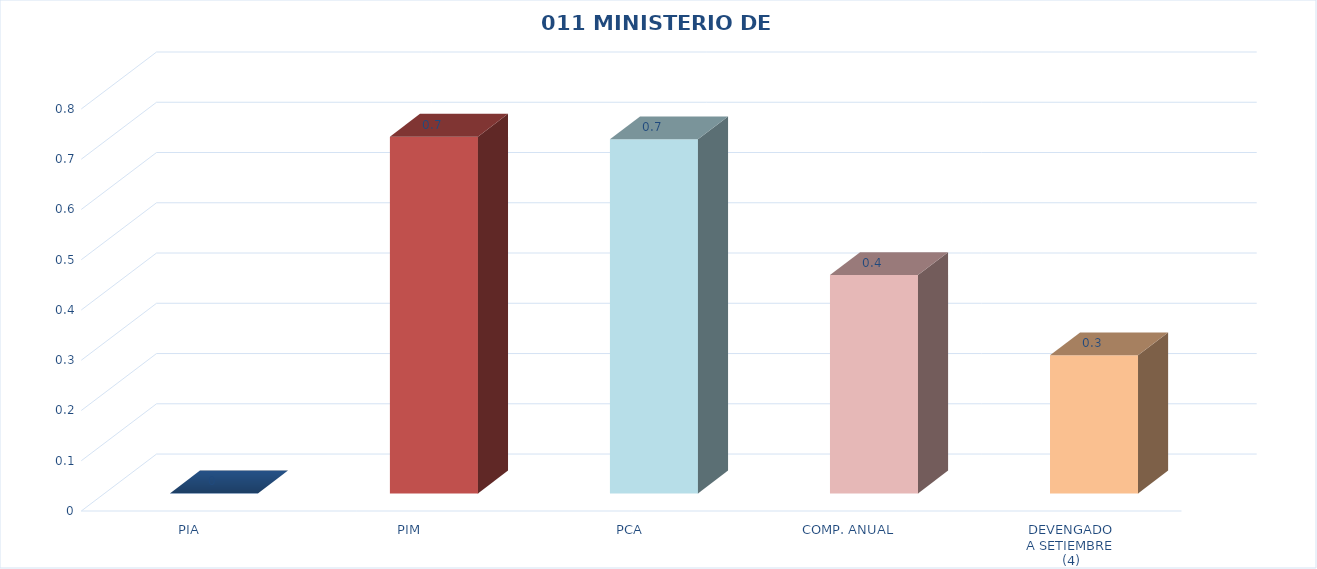
| Category | 011 MINISTERIO DE SALUD |
|---|---|
| PIA | 0 |
| PIM | 0.71 |
| PCA | 0.705 |
| COMP. ANUAL | 0.435 |
| DEVENGADO
A SETIEMBRE
(4) | 0.275 |